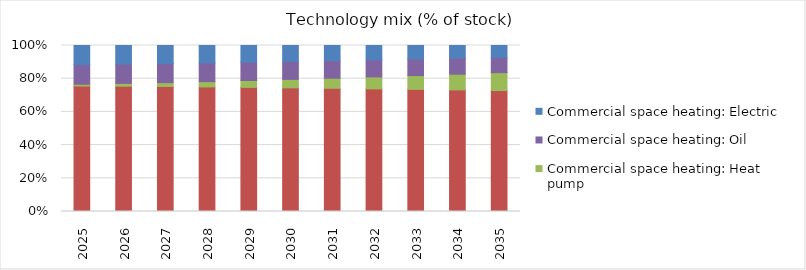
| Category | Commercial space heating: Gas | Commercial space heating: Heat pump | Commercial space heating: Oil | Commercial space heating: Electric |
|---|---|---|---|---|
| 2025.0 | 0.756 | 0.011 | 0.118 | 0.115 |
| 2026.0 | 0.755 | 0.017 | 0.116 | 0.112 |
| 2027.0 | 0.754 | 0.023 | 0.115 | 0.108 |
| 2028.0 | 0.751 | 0.032 | 0.113 | 0.104 |
| 2029.0 | 0.748 | 0.041 | 0.111 | 0.1 |
| 2030.0 | 0.745 | 0.051 | 0.108 | 0.096 |
| 2031.0 | 0.742 | 0.061 | 0.106 | 0.091 |
| 2032.0 | 0.739 | 0.072 | 0.103 | 0.087 |
| 2033.0 | 0.736 | 0.083 | 0.1 | 0.082 |
| 2034.0 | 0.733 | 0.095 | 0.096 | 0.077 |
| 2035.0 | 0.729 | 0.108 | 0.092 | 0.072 |